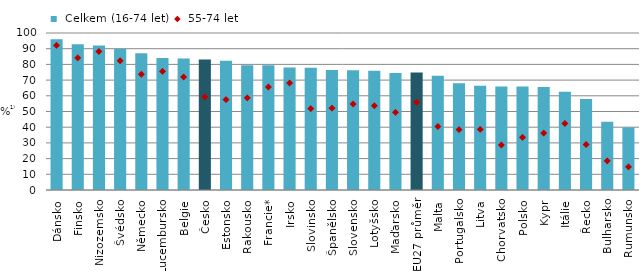
| Category |  Celkem (16-74 let) |
|---|---|
| Dánsko | 96 |
| Finsko | 92.9 |
| Nizozemsko | 92.1 |
| Švédsko | 90 |
| Německo | 87.1 |
| Lucembursko | 84.1 |
| Belgie | 83.8 |
| Česko | 83.2 |
| Estonsko | 82.4 |
| Rakousko | 79.5 |
| Francie* | 79.398 |
| Irsko | 78.1 |
| Slovinsko | 77.9 |
| Španělsko | 76.4 |
| Slovensko | 76.2 |
| Lotyšsko | 75.9 |
| Maďarsko | 74.6 |
| EU27 průměr | 74.844 |
| Malta | 72.7 |
| Portugalsko | 68 |
| Litva | 66.4 |
| Chorvatsko | 66 |
| Polsko | 65.9 |
| Kypr | 65.6 |
| Itálie | 62.651 |
| Řecko | 57.9 |
| Bulharsko | 43.5 |
| Rumunsko | 39.9 |